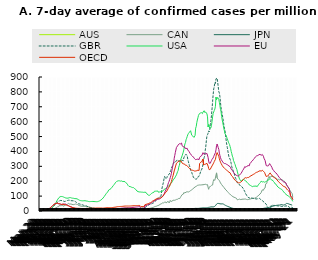
| Category | AUS | CAN | JPN | GBR | USA | EU | OECD |
|---|---|---|---|---|---|---|---|
| 2020-03-01 | 0.068 | 0.057 | 0.124 | 0.141 | 0.007 | 0.235 | 0.472 |
| 2020-03-02 | 0.084 | 0.065 | 0.134 | 0.222 | 0.017 | 0.289 | 0.587 |
| 2020-03-03 | 0.135 | 0.072 | 0.141 | 0.331 | 0.025 | 0.357 | 0.759 |
| 2020-03-04 | 0.208 | 0.084 | 0.16 | 0.445 | 0.04 | 0.464 | 1.047 |
| 2020-03-05 | 0.225 | 0.091 | 0.166 | 0.534 | 0.073 | 0.626 | 1.278 |
| 2020-03-06 | 0.253 | 0.133 | 0.208 | 0.678 | 0.096 | 0.911 | 1.622 |
| 2020-03-07 | 0.214 | 0.129 | 0.25 | 0.784 | 0.165 | 1.123 | 1.865 |
| 2020-03-08 | 0.276 | 0.152 | 0.272 | 0.829 | 0.212 | 1.43 | 2.075 |
| 2020-03-09 | 0.344 | 0.19 | 0.282 | 1.058 | 0.235 | 1.828 | 2.399 |
| 2020-03-10 | 0.383 | 0.186 | 0.325 | 1.492 | 0.308 | 2.412 | 3.005 |
| 2020-03-11 | 0.428 | 0.285 | 0.347 | 2.251 | 0.453 | 3.286 | 3.784 |
| 2020-03-12 | 0.411 | 0.304 | 0.374 | 3.191 | 0.61 | 3.887 | 4.347 |
| 2020-03-13 | 0.789 | 0.547 | 0.354 | 4.046 | 0.863 | 5.992 | 6.385 |
| 2020-03-14 | 1.053 | 0.547 | 0.372 | 4.707 | 1.121 | 7.369 | 7.589 |
| 2020-03-15 | 1.245 | 0.714 | 0.37 | 5.536 | 1.172 | 8.62 | 9.053 |
| 2020-03-16 | 1.611 | 1.285 | 0.358 | 6.53 | 1.778 | 10.068 | 10.18 |
| 2020-03-17 | 1.943 | 1.516 | 0.348 | 7.62 | 2.494 | 11.885 | 11.917 |
| 2020-03-18 | 2.478 | 2.086 | 0.326 | 8.877 | 3.491 | 13.621 | 13.341 |
| 2020-03-19 | 3.115 | 2.596 | 0.308 | 10.087 | 5.256 | 17.135 | 17.04 |
| 2020-03-20 | 3.329 | 2.85 | 0.327 | 11.743 | 7.752 | 19.271 | 19.502 |
| 2020-03-21 | 4.624 | 4.101 | 0.299 | 13.524 | 10.031 | 22.844 | 23.218 |
| 2020-03-22 | 7.052 | 4.625 | 0.315 | 15.52 | 13.79 | 25.918 | 26.673 |
| 2020-03-23 | 7.35 | 6.358 | 0.341 | 19.203 | 18.043 | 28.918 | 29.801 |
| 2020-03-24 | 8.966 | 8.787 | 0.367 | 22.629 | 21.867 | 32.645 | 33.239 |
| 2020-03-25 | 10.115 | 9.858 | 0.437 | 26.25 | 25.969 | 37.127 | 38.121 |
| 2020-03-26 | 11.991 | 12.321 | 0.507 | 30.587 | 31.784 | 40.58 | 40.997 |
| 2020-03-27 | 13.247 | 14.21 | 0.575 | 34.749 | 37.148 | 43.583 | 43.781 |
| 2020-03-28 | 14.469 | 16.338 | 0.757 | 38.222 | 43.082 | 47.144 | 46.858 |
| 2020-03-29 | 13.714 | 18.284 | 0.909 | 41.388 | 47.445 | 49.13 | 48.115 |
| 2020-03-30 | 15.089 | 20.181 | 0.97 | 45.53 | 52.162 | 50.011 | 49.692 |
| 2020-03-31 | 14.165 | 21.803 | 1.174 | 50.113 | 58.993 | 51.635 | 51.206 |
| 2020-04-01 | 14.069 | 23.977 | 1.381 | 54.861 | 67.774 | 51.609 | 51.549 |
| 2020-04-02 | 12.988 | 27.523 | 1.586 | 58.667 | 74.031 | 51.797 | 52.627 |
| 2020-04-03 | 12.318 | 29.473 | 1.837 | 62.331 | 79.952 | 52.132 | 52.475 |
| 2020-04-04 | 10.758 | 28.131 | 2.033 | 64.892 | 85.506 | 48.723 | 49.985 |
| 2020-04-05 | 9.592 | 36.013 | 2.228 | 66.467 | 90.283 | 47.717 | 49.783 |
| 2020-04-06 | 8.088 | 34.831 | 2.386 | 68.609 | 94.339 | 46.899 | 49.268 |
| 2020-04-07 | 7.525 | 35.515 | 2.523 | 70.607 | 96.278 | 45.086 | 47.739 |
| 2020-04-08 | 6.466 | 36.412 | 2.812 | 71.067 | 95.823 | 44.296 | 46.322 |
| 2020-04-09 | 5.587 | 35.61 | 3.163 | 71.039 | 97.435 | 42.886 | 44.248 |
| 2020-04-10 | 4.985 | 36.568 | 3.503 | 69.757 | 98.358 | 43.254 | 44.14 |
| 2020-04-11 | 4.241 | 39.289 | 3.876 | 68.81 | 96.927 | 43.743 | 43.848 |
| 2020-04-12 | 3.537 | 32.467 | 4.07 | 68.598 | 95.786 | 47.378 | 45.256 |
| 2020-04-13 | 3.12 | 34.649 | 4.144 | 66.264 | 93.848 | 46.891 | 43.903 |
| 2020-04-14 | 2.929 | 34.824 | 4.29 | 63.859 | 93.002 | 46.352 | 43.012 |
| 2020-04-15 | 2.422 | 34.463 | 4.316 | 63.723 | 90.474 | 46.486 | 42.495 |
| 2020-04-16 | 1.994 | 38.594 | 4.281 | 64.676 | 87.897 | 47.204 | 42.665 |
| 2020-04-17 | 1.729 | 40.874 | 4.195 | 66.065 | 87.295 | 44.422 | 40.514 |
| 2020-04-18 | 1.493 | 41.957 | 4.07 | 68.5 | 86.785 | 43.809 | 39.975 |
| 2020-04-19 | 1.662 | 43.075 | 3.893 | 69.263 | 86.28 | 39.183 | 36.728 |
| 2020-04-20 | 1.532 | 45.522 | 3.943 | 70.706 | 87.537 | 38.368 | 36.205 |
| 2020-04-21 | 1.295 | 47.001 | 3.806 | 71.635 | 86.271 | 37.557 | 35.531 |
| 2020-04-22 | 1.194 | 51.132 | 3.623 | 72.544 | 87.774 | 35.731 | 34.318 |
| 2020-04-23 | 1.126 | 47.468 | 3.475 | 72.213 | 89.322 | 33.13 | 32.204 |
| 2020-04-24 | 0.873 | 46.005 | 3.277 | 72.23 | 89.016 | 30.718 | 30.213 |
| 2020-04-25 | 0.71 | 45.663 | 2.985 | 70.161 | 90.088 | 29.158 | 29.01 |
| 2020-04-26 | 0.586 | 47.126 | 2.818 | 69.34 | 90.264 | 27.809 | 27.759 |
| 2020-04-27 | 0.552 | 45.446 | 2.623 | 69.006 | 87.598 | 26.951 | 26.761 |
| 2020-04-28 | 0.558 | 44.648 | 2.511 | 68.923 | 87.015 | 25.065 | 24.814 |
| 2020-04-29 | 0.563 | 42.573 | 2.307 | 68.805 | 85.962 | 23.361 | 23.43 |
| 2020-04-30 | 0.586 | 42.406 | 2.054 | 68.406 | 84.068 | 21.673 | 22.266 |
| 2020-05-01 | 0.569 | 43.417 | 1.928 | 67.88 | 85.2 | 21.153 | 22.01 |
| 2020-05-02 | 0.591 | 43.915 | 1.895 | 66.753 | 83.874 | 19.45 | 20.943 |
| 2020-05-03 | 0.608 | 47.396 | 1.874 | 65.698 | 82.915 | 17.978 | 20.126 |
| 2020-05-04 | 0.71 | 46.902 | 1.87 | 62.868 | 83.081 | 17.034 | 19.48 |
| 2020-05-05 | 0.738 | 45.853 | 1.69 | 60.651 | 83.061 | 16.378 | 18.978 |
| 2020-05-06 | 0.8 | 44.956 | 1.56 | 57.222 | 82.244 | 16.094 | 18.676 |
| 2020-05-07 | 0.828 | 44.633 | 1.436 | 54.681 | 81.456 | 15.713 | 18.33 |
| 2020-05-08 | 0.789 | 43.063 | 1.224 | 51.094 | 77.937 | 15.616 | 18.047 |
| 2020-05-09 | 0.789 | 41.775 | 1.011 | 48.805 | 76.973 | 15.656 | 18.065 |
| 2020-05-10 | 0.71 | 36.435 | 0.863 | 47.409 | 74.61 | 15.509 | 17.801 |
| 2020-05-11 | 0.693 | 35.371 | 0.715 | 47.847 | 72.515 | 15.3 | 17.612 |
| 2020-05-12 | 0.591 | 34.98 | 0.672 | 47.217 | 71.826 | 14.938 | 17.426 |
| 2020-05-13 | 0.535 | 33.725 | 0.614 | 46.078 | 70.019 | 13.928 | 16.989 |
| 2020-05-14 | 0.597 | 32.608 | 0.614 | 43.602 | 69.76 | 13.507 | 16.838 |
| 2020-05-15 | 0.659 | 31.487 | 0.575 | 42.465 | 68.85 | 12.867 | 16.569 |
| 2020-05-16 | 0.591 | 31.498 | 0.506 | 42.284 | 68.425 | 12.38 | 16.683 |
| 2020-05-17 | 0.597 | 31.32 | 0.455 | 41.226 | 68.205 | 11.869 | 16.461 |
| 2020-05-18 | 0.552 | 30.962 | 0.45 | 39.069 | 69.563 | 11.452 | 16.407 |
| 2020-05-19 | 0.518 | 30.685 | 0.384 | 38.325 | 68.718 | 11.164 | 16.532 |
| 2020-05-20 | 0.518 | 30.43 | 0.365 | 37.06 | 69.714 | 11.09 | 16.74 |
| 2020-05-21 | 0.428 | 30.256 | 0.301 | 36.916 | 69.256 | 10.449 | 16.549 |
| 2020-05-22 | 0.36 | 30.358 | 0.268 | 35.875 | 68.782 | 10.262 | 16.741 |
| 2020-05-23 | 0.394 | 30.195 | 0.235 | 34.683 | 67.456 | 10.162 | 17.548 |
| 2020-05-24 | 0.338 | 29.545 | 0.255 | 33.661 | 68.197 | 9.856 | 17.631 |
| 2020-05-25 | 0.327 | 29.294 | 0.241 | 31.594 | 66.579 | 9.569 | 17.874 |
| 2020-05-26 | 0.377 | 28.872 | 0.243 | 28.621 | 65.989 | 9.344 | 17.783 |
| 2020-05-27 | 0.389 | 28.177 | 0.234 | 26.689 | 64.184 | 9.083 | 17.642 |
| 2020-05-28 | 0.394 | 27.493 | 0.267 | 24.961 | 62.685 | 9.477 | 18.023 |
| 2020-05-29 | 0.479 | 26.459 | 0.326 | 23.837 | 63.04 | 9.344 | 17.877 |
| 2020-05-30 | 0.439 | 24.817 | 0.346 | 22.965 | 64.137 | 9.145 | 18.429 |
| 2020-05-31 | 0.496 | 24.22 | 0.339 | 22.369 | 63.667 | 9.159 | 18.685 |
| 2020-06-01 | 0.535 | 23.445 | 0.356 | 21.999 | 63.129 | 9.177 | 18.839 |
| 2020-06-02 | 0.507 | 22.309 | 0.379 | 21.608 | 63.935 | 8.923 | 18.615 |
| 2020-06-03 | 0.507 | 21.48 | 0.384 | 20.625 | 64.503 | 8.651 | 18.583 |
| 2020-06-04 | 0.462 | 20.116 | 0.354 | 19.556 | 64.206 | 8.503 | 18.501 |
| 2020-06-05 | 0.383 | 19.147 | 0.322 | 18.703 | 64.61 | 8.709 | 18.725 |
| 2020-06-06 | 0.377 | 18.219 | 0.321 | 18.045 | 63.533 | 9.01 | 18.979 |
| 2020-06-07 | 0.355 | 17.858 | 0.326 | 17.292 | 63.067 | 9.192 | 19.419 |
| 2020-06-08 | 0.259 | 17.068 | 0.309 | 16.548 | 63.155 | 9.324 | 19.347 |
| 2020-06-09 | 0.253 | 16.27 | 0.31 | 15.877 | 61.798 | 9.748 | 19.638 |
| 2020-06-10 | 0.253 | 15.502 | 0.316 | 15.535 | 62.344 | 10.305 | 20.182 |
| 2020-06-11 | 0.237 | 14.784 | 0.312 | 15.037 | 62.994 | 10.154 | 20.24 |
| 2020-06-12 | 0.237 | 13.864 | 0.33 | 14.926 | 62.762 | 10.154 | 20.752 |
| 2020-06-13 | 0.344 | 13.56 | 0.332 | 15.131 | 64.523 | 10.108 | 19.68 |
| 2020-06-14 | 0.394 | 12.26 | 0.373 | 15.324 | 64.973 | 9.992 | 19.798 |
| 2020-06-15 | 0.451 | 11.341 | 0.429 | 15.195 | 65.922 | 9.946 | 19.984 |
| 2020-06-16 | 0.541 | 10.816 | 0.422 | 15.033 | 68.223 | 10.029 | 20.408 |
| 2020-06-17 | 0.597 | 10.531 | 0.434 | 14.637 | 70.814 | 10.166 | 19.849 |
| 2020-06-18 | 0.676 | 10.33 | 0.454 | 14.678 | 73.161 | 10.497 | 20.079 |
| 2020-06-19 | 0.659 | 10.333 | 0.462 | 14.522 | 76.076 | 10.461 | 20.211 |
| 2020-06-20 | 0.794 | 10.333 | 0.489 | 14.05 | 79.149 | 10.235 | 19.584 |
| 2020-06-21 | 0.783 | 10.162 | 0.465 | 13.654 | 81.847 | 10.126 | 19.383 |
| 2020-06-22 | 0.817 | 10.09 | 0.431 | 13.368 | 87.215 | 10.209 | 19.528 |
| 2020-06-23 | 0.85 | 10.185 | 0.447 | 12.951 | 93.049 | 10.507 | 19.765 |
| 2020-06-24 | 0.941 | 9.866 | 0.49 | 12.474 | 96.884 | 10.656 | 20.521 |
| 2020-06-25 | 1.048 | 9.828 | 0.528 | 11.784 | 102.016 | 10.441 | 20.624 |
| 2020-06-26 | 1.07 | 8.798 | 0.57 | 11.053 | 108.297 | 10.776 | 20.713 |
| 2020-06-27 | 1.267 | 8.042 | 0.599 | 10.982 | 112.247 | 11.337 | 21.242 |
| 2020-06-28 | 1.633 | 8.038 | 0.663 | 10.497 | 119.029 | 11.757 | 21.493 |
| 2020-06-29 | 1.926 | 9.167 | 0.742 | 9.882 | 123.003 | 12.017 | 21.868 |
| 2020-06-30 | 2.247 | 8.855 | 0.833 | 8.858 | 127.074 | 11.886 | 21.92 |
| 2020-07-01 | 2.495 | 8.365 | 0.99 | 7.332 | 134.013 | 11.749 | 22.032 |
| 2020-07-02 | 2.653 | 8.285 | 1.131 | 5.85 | 141.113 | 11.905 | 22.257 |
| 2020-07-03 | 3.712 | 8.867 | 1.157 | 5.56 | 143.448 | 11.868 | 22.327 |
| 2020-07-04 | 4.264 | 8.768 | 1.366 | 5.54 | 145.335 | 11.547 | 22.231 |
| 2020-07-05 | 4.613 | 8.365 | 1.473 | 5.799 | 149.704 | 11.672 | 22.542 |
| 2020-07-06 | 5.187 | 7.544 | 1.552 | 5.26 | 150.488 | 11.567 | 22.448 |
| 2020-07-07 | 5.441 | 7.32 | 1.629 | 5.641 | 156.679 | 11.501 | 22.741 |
| 2020-07-08 | 5.942 | 7.776 | 1.61 | 6.859 | 160.291 | 11.679 | 22.965 |
| 2020-07-09 | 7.367 | 7.65 | 1.767 | 8.223 | 162.844 | 11.99 | 23.52 |
| 2020-07-10 | 7.282 | 7.685 | 2.103 | 8.244 | 170.11 | 12.139 | 24.063 |
| 2020-07-11 | 7.626 | 7.468 | 2.228 | 8.663 | 176.356 | 12.665 | 24.514 |
| 2020-07-12 | 7.868 | 7.426 | 2.459 | 8.95 | 179.695 | 12.933 | 24.883 |
| 2020-07-13 | 8.426 | 8.243 | 2.576 | 9.33 | 186.576 | 13.178 | 25.444 |
| 2020-07-14 | 9.017 | 8.844 | 2.695 | 10.739 | 189.789 | 13.714 | 25.992 |
| 2020-07-15 | 9.879 | 8.965 | 3.294 | 10.542 | 193.271 | 13.846 | 26.422 |
| 2020-07-16 | 10.47 | 9.456 | 3.273 | 10.54 | 199.07 | 14.901 | 27.544 |
| 2020-07-17 | 10.634 | 9.786 | 3.462 | 10.914 | 200.9 | 15.791 | 28.341 |
| 2020-07-18 | 11.293 | 10.356 | 3.978 | 10.929 | 201.989 | 15.795 | 28.779 |
| 2020-07-19 | 11.766 | 10.717 | 4.079 | 11.091 | 202.876 | 16.169 | 28.897 |
| 2020-07-20 | 12.261 | 11.227 | 4.052 | 11.198 | 204.266 | 16.898 | 29.556 |
| 2020-07-21 | 13.557 | 11.869 | 4.555 | 9.499 | 202.736 | 17.254 | 29.875 |
| 2020-07-22 | 14.035 | 11.77 | 4.485 | 9.546 | 203.8 | 18.384 | 30.754 |
| 2020-07-23 | 13.303 | 12.367 | 5.209 | 9.82 | 200.588 | 18.115 | 30.499 |
| 2020-07-24 | 14.131 | 13.514 | 5.407 | 9.993 | 201.05 | 18.276 | 30.614 |
| 2020-07-25 | 14.649 | 13.663 | 5.361 | 9.864 | 202.086 | 19.139 | 30.853 |
| 2020-07-26 | 16.142 | 13.762 | 5.772 | 9.905 | 199.605 | 19.164 | 30.979 |
| 2020-07-27 | 16.193 | 13.427 | 6.15 | 10.13 | 197.325 | 19.716 | 31.467 |
| 2020-07-28 | 15.139 | 12.914 | 6.396 | 10.348 | 198.168 | 19.604 | 31.797 |
| 2020-07-29 | 16.874 | 13.556 | 7.067 | 10.854 | 198.729 | 20.298 | 32.484 |
| 2020-07-30 | 18.631 | 12.462 | 7.954 | 11.019 | 198.301 | 20.865 | 32.968 |
| 2020-07-31 | 18.755 | 12.032 | 8.317 | 11.258 | 196.297 | 21.142 | 33.146 |
| 2020-08-01 | 19.668 | 11.603 | 9.187 | 11.245 | 192.497 | 21.111 | 33.273 |
| 2020-08-02 | 19.054 | 11.322 | 9.694 | 11.241 | 188.48 | 20.991 | 33.278 |
| 2020-08-03 | 19.302 | 9.509 | 10.134 | 11.782 | 183.552 | 21.29 | 33.396 |
| 2020-08-04 | 21.757 | 10.596 | 10.444 | 12.045 | 180.22 | 22.169 | 33.454 |
| 2020-08-05 | 20.231 | 10.17 | 10.527 | 12.246 | 172.649 | 21.975 | 33.164 |
| 2020-08-06 | 18.975 | 10.299 | 10.209 | 12.468 | 169.124 | 22.382 | 33.309 |
| 2020-08-07 | 19.251 | 9.965 | 10.782 | 12.449 | 165.023 | 22.754 | 33.7 |
| 2020-08-08 | 17.961 | 9.976 | 10.791 | 12.442 | 164.124 | 22.644 | 33.458 |
| 2020-08-09 | 17.342 | 9.877 | 10.936 | 13.124 | 164.215 | 22.781 | 33.492 |
| 2020-08-10 | 16.801 | 11.705 | 10.769 | 12.863 | 165.127 | 23.234 | 33.887 |
| 2020-08-11 | 15.106 | 10.375 | 10.132 | 13.885 | 160.427 | 22.876 | 34.09 |
| 2020-08-12 | 13.9 | 10.147 | 9.732 | 14.137 | 161.12 | 23.203 | 34.357 |
| 2020-08-13 | 13.912 | 10.615 | 9.395 | 14.52 | 157.619 | 23.601 | 34.645 |
| 2020-08-14 | 13.162 | 10.269 | 9.112 | 15.736 | 160.249 | 24.159 | 34.817 |
| 2020-08-15 | 12.408 | 10.174 | 8.722 | 16.279 | 157.117 | 24.677 | 35.349 |
| 2020-08-16 | 12.171 | 10.022 | 8.25 | 16.371 | 154.261 | 24.839 | 35.663 |
| 2020-08-17 | 11.602 | 8.228 | 8.033 | 16.151 | 149.496 | 25.135 | 35.371 |
| 2020-08-18 | 10.487 | 10.242 | 8.298 | 16.025 | 148.204 | 25.781 | 35.757 |
| 2020-08-19 | 10.577 | 10.28 | 8.418 | 15.604 | 144.422 | 26.181 | 36.012 |
| 2020-08-20 | 9.378 | 9.292 | 8.405 | 15.717 | 141.257 | 26.784 | 36.152 |
| 2020-08-21 | 8.826 | 10.314 | 8.068 | 14.847 | 134.071 | 27.531 | 36.403 |
| 2020-08-22 | 8.583 | 10.394 | 7.767 | 15.437 | 132.384 | 27.708 | 36.434 |
| 2020-08-23 | 7.643 | 10.691 | 7.449 | 15.3 | 130.225 | 27.967 | 36.082 |
| 2020-08-24 | 7.209 | 12.83 | 7.287 | 15.854 | 130.158 | 28.885 | 37.178 |
| 2020-08-25 | 6.843 | 10.714 | 7.074 | 16.057 | 128.124 | 29.239 | 37.151 |
| 2020-08-26 | 6.117 | 11.295 | 6.846 | 16.561 | 127.169 | 29.599 | 37.334 |
| 2020-08-27 | 5.863 | 12.203 | 6.509 | 17.288 | 127.753 | 29.657 | 37.502 |
| 2020-08-28 | 5.322 | 11.489 | 6.279 | 17.807 | 126.89 | 16.451 | 28.999 |
| 2020-08-29 | 4.838 | 11.702 | 6.151 | 17.423 | 126.754 | 16.74 | 29.084 |
| 2020-08-30 | 4.68 | 11.671 | 5.996 | 18.863 | 126.819 | 16.861 | 29.344 |
| 2020-08-31 | 4.314 | 12.633 | 5.926 | 19.791 | 126.325 | 17.431 | 29.587 |
| 2020-09-01 | 4.05 | 13.374 | 5.81 | 20.028 | 126.98 | 17.623 | 29.896 |
| 2020-09-02 | 4.095 | 13.534 | 5.476 | 21.011 | 125.173 | 18.746 | 31.154 |
| 2020-09-03 | 3.875 | 14.028 | 5.233 | 21.467 | 124.663 | 19.641 | 31.945 |
| 2020-09-04 | 3.717 | 14.438 | 4.941 | 22.886 | 126.206 | 33.97 | 41.758 |
| 2020-09-05 | 3.424 | 14.715 | 4.655 | 24.393 | 126.362 | 35.084 | 42.682 |
| 2020-09-06 | 3.239 | 15.21 | 4.48 | 27.114 | 124.964 | 36.481 | 44.183 |
| 2020-09-07 | 3.12 | 12.834 | 4.319 | 30.41 | 119.819 | 38.053 | 45.435 |
| 2020-09-08 | 3.053 | 16.475 | 4.187 | 32.9 | 113.521 | 39.78 | 46.908 |
| 2020-09-09 | 2.675 | 15.939 | 4.124 | 35.36 | 110.493 | 40.473 | 47.497 |
| 2020-09-10 | 2.411 | 16.832 | 4.116 | 37.891 | 106.952 | 42.457 | 49.323 |
| 2020-09-11 | 2.253 | 17.235 | 4.177 | 41.309 | 105.813 | 44.236 | 51.031 |
| 2020-09-12 | 2.101 | 17.684 | 4.23 | 44.908 | 104.932 | 46.497 | 53.003 |
| 2020-09-13 | 2.09 | 18.052 | 4.218 | 45.639 | 106.317 | 47.33 | 53.966 |
| 2020-09-14 | 2.061 | 22.054 | 4.187 | 44.94 | 111.043 | 49.568 | 56.254 |
| 2020-09-15 | 1.763 | 19.546 | 4.211 | 46.315 | 116.316 | 51.793 | 58.677 |
| 2020-09-16 | 1.628 | 21.727 | 4.224 | 49.162 | 118.475 | 54.407 | 60.832 |
| 2020-09-17 | 1.673 | 22.51 | 4.041 | 50.179 | 122.42 | 58.387 | 64.218 |
| 2020-09-18 | 1.566 | 24.236 | 3.963 | 51.853 | 123.075 | 62.603 | 67.669 |
| 2020-09-19 | 1.391 | 24.486 | 3.91 | 53.83 | 123.553 | 63.789 | 69.588 |
| 2020-09-20 | 1.239 | 27.021 | 3.955 | 55.046 | 125.321 | 65.991 | 70.423 |
| 2020-09-21 | 1.143 | 28.447 | 4.014 | 58.781 | 132.957 | 68.769 | 73.091 |
| 2020-09-22 | 1.093 | 30.233 | 3.764 | 62.677 | 133.111 | 71.569 | 76.05 |
| 2020-09-23 | 0.941 | 30.734 | 3.408 | 67.352 | 133.131 | 73.613 | 78.954 |
| 2020-09-24 | 0.783 | 31.194 | 3.396 | 74.275 | 133.99 | 74.144 | 80.76 |
| 2020-09-25 | 0.738 | 32.927 | 3.386 | 79.728 | 133.554 | 75.442 | 83.448 |
| 2020-09-26 | 0.8 | 34.824 | 3.441 | 83.189 | 134.639 | 76.966 | 85.056 |
| 2020-09-27 | 0.743 | 36.781 | 3.444 | 87.021 | 134.244 | 78.241 | 86.691 |
| 2020-09-28 | 0.636 | 36.621 | 3.419 | 86.329 | 126.089 | 78.622 | 85.034 |
| 2020-09-29 | 0.597 | 38.522 | 3.676 | 91.067 | 127.65 | 77.708 | 83.473 |
| 2020-09-30 | 0.653 | 42.444 | 4.053 | 93.055 | 127.812 | 80.981 | 86.154 |
| 2020-10-01 | 0.614 | 45.009 | 4.247 | 93.654 | 127.177 | 82.921 | 87.37 |
| 2020-10-02 | 0.591 | 46.886 | 4.202 | 93.857 | 130.084 | 85.994 | 88.421 |
| 2020-10-03 | 0.535 | 47.848 | 4.121 | 108.456 | 131.774 | 89.297 | 89.604 |
| 2020-10-04 | 0.586 | 49.684 | 4.028 | 145.368 | 130.994 | 91.667 | 92.126 |
| 2020-10-05 | 0.665 | 53.834 | 4.009 | 163.641 | 133.699 | 94.754 | 98.113 |
| 2020-10-06 | 0.58 | 56.114 | 3.98 | 179.456 | 134.485 | 99.622 | 102.577 |
| 2020-10-07 | 0.62 | 54.244 | 3.901 | 194.534 | 139.546 | 104.472 | 104.926 |
| 2020-10-08 | 0.659 | 56.247 | 3.886 | 217.247 | 145.178 | 112.34 | 109.777 |
| 2020-10-09 | 0.693 | 59.177 | 3.959 | 231.987 | 145.796 | 121.043 | 115.258 |
| 2020-10-10 | 0.721 | 62.354 | 4.092 | 236.89 | 148.574 | 132.54 | 122.233 |
| 2020-10-11 | 0.772 | 60.435 | 4.134 | 215.325 | 153.024 | 140.763 | 126.572 |
| 2020-10-12 | 0.772 | 53.184 | 4.101 | 218.273 | 154.066 | 144.651 | 128.019 |
| 2020-10-13 | 0.879 | 59.793 | 4.088 | 224.023 | 157.109 | 154.651 | 133.434 |
| 2020-10-14 | 0.85 | 63.407 | 4.135 | 235.911 | 160.896 | 166.535 | 140.926 |
| 2020-10-15 | 0.817 | 63.21 | 4.212 | 238.985 | 163.636 | 180.02 | 148.777 |
| 2020-10-16 | 0.755 | 61.959 | 4.273 | 242.771 | 169.192 | 191.61 | 156.116 |
| 2020-10-17 | 0.715 | 54.347 | 4.195 | 244.921 | 169.983 | 199.737 | 160.621 |
| 2020-10-18 | 0.642 | 62.332 | 4.184 | 253.704 | 171.462 | 212.231 | 168.385 |
| 2020-10-19 | 0.535 | 71.194 | 4.25 | 264.03 | 182.739 | 223.855 | 177.666 |
| 2020-10-20 | 0.597 | 64.076 | 4.234 | 272.789 | 186.971 | 235.958 | 185.873 |
| 2020-10-21 | 0.569 | 64.502 | 4.323 | 287.673 | 188.502 | 253.333 | 197.616 |
| 2020-10-22 | 0.591 | 65.577 | 4.222 | 292.503 | 193.468 | 273.613 | 211.346 |
| 2020-10-23 | 0.659 | 66.854 | 4.327 | 302.968 | 199.041 | 294.519 | 225.776 |
| 2020-10-24 | 0.693 | 72.148 | 4.445 | 317.591 | 210.353 | 311.086 | 237.292 |
| 2020-10-25 | 0.71 | 68.675 | 4.522 | 323.595 | 215.924 | 320.428 | 243.56 |
| 2020-10-26 | 0.755 | 71.685 | 4.633 | 328.056 | 215.772 | 354.012 | 269 |
| 2020-10-27 | 0.62 | 73.554 | 4.81 | 331.38 | 222.245 | 373.064 | 281.744 |
| 2020-10-28 | 0.603 | 73.463 | 4.935 | 327.133 | 229.261 | 392.775 | 295.791 |
| 2020-10-29 | 0.58 | 75.12 | 5.137 | 331.038 | 235.682 | 409.999 | 308.514 |
| 2020-10-30 | 0.507 | 77.606 | 5.184 | 339.318 | 243.207 | 426.838 | 320.593 |
| 2020-10-31 | 0.462 | 80.806 | 5.349 | 336.974 | 246.239 | 432.657 | 323.894 |
| 2020-11-01 | 0.428 | 78.955 | 5.485 | 344.378 | 264.826 | 437.459 | 326.785 |
| 2020-11-02 | 0.4 | 76.789 | 5.576 | 340.231 | 272.619 | 444.24 | 332.9 |
| 2020-11-03 | 0.389 | 84.42 | 5.841 | 334.103 | 294.499 | 450.287 | 335.709 |
| 2020-11-04 | 0.366 | 84.872 | 5.715 | 335.123 | 305.468 | 451.7 | 335.675 |
| 2020-11-05 | 0.366 | 83.987 | 5.985 | 337.416 | 322.138 | 451.87 | 335.143 |
| 2020-11-06 | 0.377 | 90.968 | 6.433 | 335.026 | 334.657 | 450.834 | 333.29 |
| 2020-11-07 | 0.355 | 98.463 | 6.915 | 341.529 | 351.089 | 456.808 | 336.352 |
| 2020-11-08 | 0.36 | 104.574 | 7.299 | 335.796 | 355.539 | 456.342 | 336.113 |
| 2020-11-09 | 0.332 | 109.674 | 7.648 | 340.926 | 370.887 | 438.203 | 321.75 |
| 2020-11-10 | 0.276 | 108.561 | 8.121 | 341.768 | 376.71 | 437.747 | 321.22 |
| 2020-11-11 | 0.253 | 113.129 | 9.145 | 337.008 | 394.997 | 431.624 | 316.938 |
| 2020-11-12 | 0.18 | 123.352 | 9.833 | 356.955 | 410.441 | 435.301 | 319.247 |
| 2020-11-13 | 0.169 | 120.984 | 10.436 | 365.535 | 433.24 | 431.889 | 316.44 |
| 2020-11-14 | 0.299 | 121.304 | 10.945 | 369.602 | 450.784 | 422.525 | 311.022 |
| 2020-11-15 | 0.473 | 122.66 | 11.56 | 378.986 | 459.99 | 416.479 | 307.008 |
| 2020-11-16 | 0.501 | 127.077 | 11.728 | 379.014 | 478.431 | 419.611 | 307.125 |
| 2020-11-17 | 0.597 | 127.141 | 12.174 | 378.242 | 488.627 | 418.705 | 306.495 |
| 2020-11-18 | 0.62 | 129.171 | 12.973 | 371.101 | 500.182 | 420.972 | 306.701 |
| 2020-11-19 | 0.653 | 126.586 | 13.808 | 348.539 | 511.807 | 410 | 297.843 |
| 2020-11-20 | 0.698 | 127.411 | 14.623 | 333.472 | 519.6 | 403.611 | 293.018 |
| 2020-11-21 | 0.62 | 129.414 | 15.566 | 318.542 | 524.611 | 400.921 | 291.095 |
| 2020-11-22 | 0.479 | 131.101 | 16.318 | 305.076 | 529.207 | 398.448 | 290.161 |
| 2020-11-23 | 0.479 | 133.997 | 16.968 | 292.437 | 534.214 | 387.816 | 282.742 |
| 2020-11-24 | 0.428 | 137.114 | 16.45 | 273.73 | 539.259 | 383.905 | 279.854 |
| 2020-11-25 | 0.451 | 138.786 | 16.132 | 270.746 | 543.659 | 376.856 | 275.576 |
| 2020-11-26 | 0.456 | 142.149 | 16.254 | 259.289 | 509.178 | 374.346 | 274.803 |
| 2020-11-27 | 0.451 | 145.824 | 16.397 | 247.505 | 513.483 | 369.64 | 274.093 |
| 2020-11-28 | 0.4 | 148.553 | 16.503 | 238.947 | 503.15 | 364.614 | 272.575 |
| 2020-11-29 | 0.383 | 150.978 | 16.384 | 225.038 | 500.3 | 362.021 | 271.853 |
| 2020-11-30 | 0.389 | 155.158 | 16.301 | 218.369 | 494.259 | 357.366 | 269.702 |
| 2020-12-01 | 0.394 | 155.968 | 17.186 | 222.922 | 499.789 | 351.454 | 268.446 |
| 2020-12-02 | 0.417 | 161.653 | 17.76 | 218.555 | 508.175 | 349.346 | 269.796 |
| 2020-12-03 | 0.428 | 163.877 | 17.778 | 212.833 | 556.612 | 345.029 | 268.851 |
| 2020-12-04 | 0.394 | 165.644 | 17.66 | 216.165 | 567.317 | 343.996 | 267.755 |
| 2020-12-05 | 0.411 | 168.224 | 17.438 | 215.456 | 593.434 | 346.967 | 270.754 |
| 2020-12-06 | 0.394 | 171.728 | 17.426 | 226.391 | 611.182 | 348.927 | 273.179 |
| 2020-12-07 | 0.422 | 171.078 | 17.505 | 231.495 | 626.105 | 348.679 | 274.37 |
| 2020-12-08 | 0.394 | 173.648 | 17.668 | 229.042 | 641.891 | 347.112 | 273.344 |
| 2020-12-09 | 0.344 | 173.439 | 18.099 | 229.914 | 650.588 | 344.99 | 271.962 |
| 2020-12-10 | 0.349 | 175.042 | 18.632 | 242.922 | 654.027 | 359.741 | 319.156 |
| 2020-12-11 | 0.389 | 176.167 | 19.147 | 254.409 | 657.157 | 363.523 | 323.004 |
| 2020-12-12 | 0.366 | 174.761 | 19.689 | 267.153 | 658.046 | 368.559 | 327.631 |
| 2020-12-13 | 0.366 | 173.283 | 20.051 | 269.666 | 660.959 | 372.604 | 330.615 |
| 2020-12-14 | 0.344 | 175.764 | 20.226 | 281.519 | 660.942 | 373.147 | 332.427 |
| 2020-12-15 | 0.377 | 176.042 | 20.546 | 294.705 | 654.203 | 379.109 | 337.492 |
| 2020-12-16 | 0.406 | 176.471 | 20.73 | 313.051 | 664.718 | 391.954 | 349.223 |
| 2020-12-17 | 0.462 | 177.688 | 20.981 | 343.871 | 668.291 | 383.482 | 309.505 |
| 2020-12-18 | 0.569 | 177.631 | 20.867 | 358.481 | 673.51 | 387.041 | 313.854 |
| 2020-12-19 | 0.777 | 179.436 | 20.98 | 370.346 | 662.334 | 385.386 | 313.611 |
| 2020-12-20 | 0.907 | 179.782 | 21.079 | 407.711 | 662.385 | 384.434 | 314.746 |
| 2020-12-21 | 0.963 | 176.741 | 21.229 | 435.714 | 664.225 | 383.692 | 315.686 |
| 2020-12-22 | 0.997 | 176.802 | 21.474 | 474.944 | 659.44 | 388.149 | 321.265 |
| 2020-12-23 | 1.07 | 178.356 | 21.786 | 505.031 | 652.005 | 386.673 | 320.157 |
| 2020-12-24 | 1.019 | 177.133 | 22.423 | 512.839 | 632.193 | 381.327 | 317.945 |
| 2020-12-25 | 0.963 | 158.316 | 23.558 | 521.855 | 565.029 | 360.179 | 301.611 |
| 2020-12-26 | 0.789 | 145.604 | 24.497 | 538.187 | 579.992 | 335.587 | 286.978 |
| 2020-12-27 | 0.783 | 161.159 | 25.052 | 530.518 | 565.985 | 321.099 | 277.279 |
| 2020-12-28 | 0.732 | 156.933 | 25.697 | 547.663 | 555.359 | 314.502 | 274.609 |
| 2020-12-29 | 0.811 | 164.264 | 26.795 | 582.572 | 556.335 | 320.883 | 280.481 |
| 2020-12-30 | 0.805 | 170.109 | 27.452 | 605.627 | 558.104 | 331.21 | 289.033 |
| 2020-12-31 | 0.85 | 171.854 | 28.333 | 641.656 | 576.15 | 338.44 | 295.455 |
| 2021-01-01 | 0.918 | 168.973 | 27.712 | 685.603 | 600.514 | 347.005 | 302.844 |
| 2021-01-02 | 0.991 | 174.374 | 26.735 | 734.831 | 632.73 | 349.242 | 307.71 |
| 2021-01-03 | 0.941 | 197.332 | 27.019 | 783.245 | 655.846 | 356.441 | 316.45 |
| 2021-01-04 | 0.946 | 210.987 | 28.103 | 820.435 | 660.045 | 366.406 | 324.187 |
| 2021-01-05 | 0.873 | 207.419 | 29.593 | 837.067 | 675.216 | 375.043 | 332.466 |
| 2021-01-06 | 0.794 | 205.986 | 31.962 | 863.356 | 684.686 | 375.198 | 335.123 |
| 2021-01-07 | 0.822 | 210.106 | 35.383 | 856.358 | 703.237 | 392.042 | 347.433 |
| 2021-01-08 | 0.687 | 241.444 | 40.594 | 887.924 | 764.859 | 410.885 | 365.819 |
| 2021-01-09 | 0.625 | 256.107 | 45.98 | 892.654 | 747.617 | 439.251 | 385.403 |
| 2021-01-10 | 0.62 | 222.442 | 49.245 | 892.547 | 749.577 | 450.079 | 392.424 |
| 2021-01-11 | 0.659 | 215.856 | 51.05 | 865.583 | 762.943 | 444.643 | 388.875 |
| 2021-01-12 | 0.642 | 211.641 | 50.631 | 832.702 | 759.378 | 425.906 | 375.671 |
| 2021-01-13 | 0.642 | 208.057 | 50.482 | 801.074 | 748.462 | 413.572 | 367.191 |
| 2021-01-14 | 0.552 | 205.093 | 49.386 | 792.661 | 729.929 | 388.785 | 350.718 |
| 2021-01-15 | 0.603 | 196.135 | 48.565 | 766.387 | 707.087 | 371.523 | 337.537 |
| 2021-01-16 | 0.636 | 188.405 | 47.751 | 726.64 | 681.402 | 358.888 | 327.937 |
| 2021-01-17 | 0.603 | 184.608 | 47.403 | 691.71 | 665.967 | 347.184 | 319.777 |
| 2021-01-18 | 0.546 | 177.368 | 47.36 | 673.255 | 634.814 | 342.716 | 313.081 |
| 2021-01-19 | 0.507 | 173.138 | 48.275 | 647.224 | 612.96 | 335.241 | 305.992 |
| 2021-01-20 | 0.501 | 167.673 | 47.935 | 628.799 | 592.45 | 329.427 | 301.114 |
| 2021-01-21 | 0.484 | 162.596 | 46.835 | 605.736 | 574.219 | 323.627 | 294.76 |
| 2021-01-22 | 0.4 | 158.594 | 44.468 | 572.605 | 551.597 | 320.387 | 290.694 |
| 2021-01-23 | 0.327 | 153.786 | 41.846 | 555.954 | 538.076 | 318.932 | 286.853 |
| 2021-01-24 | 0.315 | 147.687 | 39.807 | 537.585 | 517.742 | 318.35 | 282.872 |
| 2021-01-25 | 0.276 | 144.635 | 37.426 | 504.796 | 521.465 | 318.037 | 279.892 |
| 2021-01-26 | 0.259 | 140.884 | 35.703 | 476.438 | 508.771 | 314.534 | 276.22 |
| 2021-01-27 | 0.253 | 135.635 | 33.913 | 447.374 | 496.023 | 312.824 | 273.82 |
| 2021-01-28 | 0.248 | 130.676 | 32.262 | 427.684 | 485.052 | 311.647 | 271.464 |
| 2021-01-29 | 0.259 | 126.875 | 30.555 | 403.783 | 474.526 | 308.959 | 267.454 |
| 2021-01-30 | 0.253 | 123.135 | 28.931 | 381.816 | 462.209 | 304.828 | 262.915 |
| 2021-01-31 | 0.231 | 120.3 | 27.456 | 362.758 | 453.911 | 302.154 | 260.29 |
| 2021-02-01 | 0.242 | 116.063 | 26.33 | 355.089 | 446.614 | 300.445 | 260.361 |
| 2021-02-02 | 0.242 | 111.909 | 24.579 | 348.146 | 432.597 | 297.426 | 256.501 |
| 2021-02-03 | 0.248 | 107.907 | 23.101 | 335.095 | 418.537 | 289.944 | 248.642 |
| 2021-02-04 | 0.242 | 104.775 | 21.325 | 317.897 | 399.111 | 280.829 | 240.457 |
| 2021-02-05 | 0.237 | 102.149 | 20.001 | 296.597 | 385.109 | 276.782 | 236.586 |
| 2021-02-06 | 0.225 | 98.934 | 18.814 | 285.881 | 368.43 | 272.015 | 232.422 |
| 2021-02-07 | 0.22 | 96.175 | 17.649 | 274.675 | 358.703 | 267.962 | 229.556 |
| 2021-02-08 | 0.208 | 93.518 | 17.012 | 265.05 | 339.167 | 260.961 | 221.327 |
| 2021-02-09 | 0.237 | 92.511 | 16.158 | 255.482 | 330.593 | 252.498 | 214.578 |
| 2021-02-10 | 0.231 | 92.515 | 15.312 | 242.253 | 319.075 | 247.939 | 208.975 |
| 2021-02-11 | 0.253 | 89.456 | 14.293 | 226.992 | 311.147 | 246.819 | 206.482 |
| 2021-02-12 | 0.248 | 83.918 | 13.105 | 218.506 | 296.019 | 241.088 | 200.794 |
| 2021-02-13 | 0.265 | 85.944 | 12.078 | 207.915 | 288.679 | 239.943 | 198.498 |
| 2021-02-14 | 0.242 | 82.132 | 11.754 | 197.499 | 277.961 | 238.204 | 194.861 |
| 2021-02-15 | 0.253 | 74.379 | 11.467 | 188.224 | 262.237 | 236.156 | 192.914 |
| 2021-02-16 | 0.225 | 80.217 | 11.184 | 184.507 | 247.913 | 237.379 | 191.683 |
| 2021-02-17 | 0.186 | 77.53 | 10.705 | 183.874 | 237.006 | 236.268 | 189.345 |
| 2021-02-18 | 0.175 | 78.51 | 10.518 | 180.803 | 221.41 | 237.012 | 188.334 |
| 2021-02-19 | 0.158 | 80.046 | 10.496 | 174.14 | 212.557 | 242.204 | 189.924 |
| 2021-02-20 | 0.158 | 75.713 | 10.351 | 167.94 | 205.769 | 246.622 | 190.904 |
| 2021-02-21 | 0.169 | 76.485 | 9.995 | 165.507 | 202.313 | 250.961 | 194.671 |
| 2021-02-22 | 0.18 | 82.907 | 9.728 | 167.38 | 203.198 | 254.668 | 196.261 |
| 2021-02-23 | 0.158 | 79.084 | 9.496 | 162.814 | 207.352 | 262.459 | 201.019 |
| 2021-02-24 | 0.197 | 80.544 | 8.866 | 156.874 | 209.36 | 270.885 | 206.102 |
| 2021-02-25 | 0.22 | 79.449 | 8.367 | 152.445 | 212.657 | 276.109 | 209.381 |
| 2021-02-26 | 0.253 | 79.787 | 8.095 | 144.955 | 211.808 | 281.6 | 212.936 |
| 2021-02-27 | 0.248 | 79.875 | 8.079 | 138.603 | 208.784 | 289.796 | 218.727 |
| 2021-02-28 | 0.27 | 79.647 | 8.035 | 130.482 | 206.293 | 298.19 | 222.348 |
| 2021-03-01 | 0.276 | 80.563 | 7.98 | 119.397 | 207.167 | 300.805 | 223.834 |
| 2021-03-02 | 0.321 | 78.472 | 7.775 | 114.913 | 200.55 | 293.621 | 218.973 |
| 2021-03-03 | 0.338 | 77.86 | 8.16 | 107.319 | 197.269 | 297.401 | 221.621 |
| 2021-03-04 | 0.36 | 77.226 | 8.233 | 100.025 | 193.156 | 301.398 | 223.69 |
| 2021-03-05 | 0.36 | 76.447 | 8.315 | 94.517 | 188.415 | 304.892 | 225.236 |
| 2021-03-06 | 0.36 | 76.785 | 7.401 | 91.535 | 185.641 | 305.24 | 225.583 |
| 2021-03-07 | 0.383 | 77.929 | 8.221 | 89.701 | 181.137 | 304.696 | 225.363 |
| 2021-03-08 | 0.422 | 79.274 | 8.145 | 88.113 | 175.395 | 303.757 | 224.186 |
| 2021-03-09 | 0.439 | 80.281 | 8.431 | 86.777 | 175.648 | 317.979 | 232.159 |
| 2021-03-10 | 0.467 | 81.326 | 8.448 | 85.796 | 171.612 | 320.763 | 232.892 |
| 2021-03-11 | 0.456 | 81.801 | 8.622 | 86.181 | 169.185 | 327.451 | 236.688 |
| 2021-03-12 | 0.467 | 83.884 | 8.774 | 87.598 | 167.04 | 328.258 | 237.132 |
| 2021-03-13 | 0.467 | 84.876 | 9.818 | 86.519 | 164.746 | 334.742 | 240.819 |
| 2021-03-14 | 0.473 | 85.115 | 8.973 | 85.324 | 163.534 | 337.004 | 242.009 |
| 2021-03-15 | 0.428 | 84.215 | 9.077 | 86.13 | 168.596 | 344.332 | 245.652 |
| 2021-03-16 | 0.451 | 83.945 | 9.04 | 85.121 | 166.992 | 349.324 | 248.055 |
| 2021-03-17 | 0.428 | 85.268 | 9.364 | 84.762 | 167.521 | 353.532 | 249.583 |
| 2021-03-18 | 0.456 | 87.198 | 9.541 | 83.8 | 166.678 | 356.05 | 250.921 |
| 2021-03-19 | 0.451 | 89.923 | 9.774 | 79.937 | 166.724 | 364.249 | 255.897 |
| 2021-03-20 | 0.445 | 91.394 | 10.07 | 80.051 | 167.787 | 361.855 | 254.143 |
| 2021-03-21 | 0.428 | 92.967 | 10.218 | 81.534 | 165.849 | 370.313 | 259.928 |
| 2021-03-22 | 0.417 | 96.965 | 10.3 | 82.075 | 163.641 | 373.26 | 262.634 |
| 2021-03-23 | 0.377 | 99.671 | 10.725 | 82.257 | 163.487 | 372.378 | 262.368 |
| 2021-03-24 | 0.36 | 101.731 | 11.21 | 81.927 | 175.597 | 373.821 | 264.227 |
| 2021-03-25 | 0.315 | 107.398 | 11.72 | 81.75 | 178.612 | 377.681 | 267.214 |
| 2021-03-26 | 0.338 | 110.411 | 12.295 | 84.71 | 185.441 | 377.666 | 268.092 |
| 2021-03-27 | 0.355 | 113.824 | 12.843 | 81.03 | 188.63 | 381.207 | 270.629 |
| 2021-03-28 | 0.394 | 117.845 | 13.609 | 77.93 | 192.69 | 375.172 | 267.45 |
| 2021-03-29 | 0.479 | 123.162 | 14.179 | 76.46 | 200.452 | 373.776 | 267.679 |
| 2021-03-30 | 0.467 | 123.861 | 14.885 | 73.598 | 203.78 | 378.308 | 271.163 |
| 2021-03-31 | 0.518 | 142.024 | 15.892 | 70.28 | 195.11 | 379.776 | 273.339 |
| 2021-04-01 | 0.529 | 144.445 | 16.669 | 66.557 | 200.15 | 376.212 | 272.01 |
| 2021-04-02 | 0.501 | 139.253 | 17.503 | 60.604 | 196.89 | 367.786 | 266.869 |
| 2021-04-03 | 0.501 | 149.792 | 18.262 | 59.659 | 197.05 | 354.583 | 260.279 |
| 2021-04-04 | 0.456 | 147.242 | 19.098 | 56.314 | 193.514 | 352.037 | 259.082 |
| 2021-04-05 | 0.389 | 155.071 | 19.41 | 52.27 | 197.104 | 339.045 | 249.185 |
| 2021-04-06 | 0.422 | 181.564 | 19.947 | 48.72 | 196.797 | 322.182 | 244.041 |
| 2021-04-07 | 0.355 | 176.471 | 20.613 | 45.962 | 200.279 | 304.83 | 231.659 |
| 2021-04-08 | 0.321 | 185.954 | 21.623 | 42.867 | 200.641 | 305.166 | 233.95 |
| 2021-04-09 | 0.31 | 206.564 | 22.49 | 25.207 | 206.241 | 302.618 | 234.661 |
| 2021-04-10 | 0.321 | 208.099 | 23.571 | 23.414 | 207.751 | 302.633 | 235.604 |
| 2021-04-11 | 0.349 | 224.061 | 23.772 | 22.202 | 212.716 | 304.328 | 238.809 |
| 2021-04-12 | 0.36 | 233.167 | 24.391 | 23.925 | 209.474 | 309.358 | 246.752 |
| 2021-04-13 | 0.4 | 220.622 | 25.334 | 24.121 | 217.018 | 318.315 | 250.526 |
| 2021-04-14 | 0.473 | 226.725 | 27.63 | 23.542 | 217.165 | 320.909 | 256.06 |
| 2021-04-15 | 0.529 | 231.943 | 28.789 | 22.775 | 214.732 | 306.094 | 247.305 |
| 2021-04-16 | 0.58 | 232.882 | 29.955 | 39.054 | 213.554 | 299.911 | 244.481 |
| 2021-04-17 | 0.642 | 232.247 | 31.195 | 38.246 | 207.39 | 293.749 | 241.218 |
| 2021-04-18 | 0.642 | 234.136 | 32.792 | 38.571 | 205.492 | 281.931 | 233.698 |
| 2021-04-19 | 0.715 | 232.243 | 32.974 | 37.278 | 204.492 | 278.191 | 231.46 |
| 2021-04-20 | 0.71 | 231.495 | 34.698 | 37.391 | 197.265 | 272.553 | 228.009 |
| 2021-04-21 | 0.704 | 228.614 | 34.57 | 37.188 | 191.817 | 267.226 | 225.005 |
| 2021-04-22 | 0.867 | 226.508 | 35.714 | 37.31 | 188.757 | 262.056 | 222.732 |
| 2021-04-23 | 0.867 | 223.696 | 36.283 | 37.143 | 181.1 | 258.848 | 219.436 |
| 2021-04-24 | 0.811 | 223.86 | 37.211 | 36.833 | 181.531 | 256.17 | 216.859 |
| 2021-04-25 | 0.828 | 218.984 | 37.79 | 36.47 | 177.199 | 251.927 | 212.962 |
| 2021-04-26 | 0.907 | 213.724 | 38.932 | 34.548 | 168.39 | 247.74 | 209.407 |
| 2021-04-27 | 0.98 | 212.276 | 38.924 | 34.892 | 163.856 | 242.429 | 205.302 |
| 2021-04-28 | 1.008 | 212.314 | 37.144 | 34.401 | 160.491 | 236.783 | 200.477 |
| 2021-04-29 | 0.901 | 212.827 | 39.846 | 33.796 | 156.549 | 232.887 | 196.16 |
| 2021-04-30 | 0.89 | 211.573 | 39.473 | 33.161 | 154.6 | 225.239 | 191.498 |
| 2021-05-01 | 0.907 | 208.445 | 39.888 | 32.832 | 151.092 | 222.643 | 189.196 |
| 2021-05-02 | 0.89 | 204.796 | 41.329 | 32.744 | 149.918 | 217.736 | 185.435 |
| 2021-05-03 | 0.749 | 212.766 | 42.678 | 31.857 | 151.167 | 216.01 | 183.432 |
| 2021-05-04 | 0.648 | 211.979 | 41.808 | 30.277 | 146.761 | 210.609 | 179.27 |
| 2021-05-05 | 0.625 | 210.284 | 42.116 | 30.23 | 142.239 | 204.06 | 173.479 |
| 2021-05-06 | 0.535 | 205.598 | 38.121 | 30.589 | 137.589 | 200.385 | 170.101 |
| 2021-05-07 | 0.535 | 203.246 | 39.662 | 30.822 | 132.961 | 198.84 | 167.846 |
| 2021-05-08 | 0.552 | 201.501 | 41.087 | 31.122 | 128.256 | 195.29 | 164.995 |
| 2021-05-09 | 0.524 | 200.464 | 41.858 | 31.333 | 124.785 | 194.809 | 163.939 |
| 2021-05-10 | 0.496 | 192.601 | 42.29 | 32.847 | 118.839 | 193.42 | 162.129 |
| 2021-05-11 | 0.456 | 187.797 | 44.737 | 33.975 | 115.757 | 191.145 | 159.558 |
| 2021-05-12 | 0.4 | 183.073 | 48.644 | 34.274 | 111.902 | 187.733 | 157.32 |
| 2021-05-13 | 0.36 | 174.822 | 50.888 | 34.366 | 107.799 | 176.245 | 148.527 |
| 2021-05-14 | 0.327 | 171.565 | 51.162 | 33.732 | 105.627 | 170.312 | 144.972 |
| 2021-05-15 | 0.299 | 165.503 | 50.124 | 33.689 | 103.155 | 163.223 | 140.327 |
| 2021-05-16 | 0.265 | 160.217 | 48.638 | 34.022 | 101.184 | 160.045 | 137.954 |
| 2021-05-17 | 0.253 | 150.944 | 47.372 | 33.214 | 97.602 | 154.55 | 133.351 |
| 2021-05-18 | 0.259 | 145.254 | 46.064 | 22.873 | 95.063 | 146.132 | 127.137 |
| 2021-05-19 | 0.225 | 138.63 | 44.178 | 22.555 | 92.197 | 140.149 | 123.165 |
| 2021-05-20 | 0.237 | 135.02 | 43.435 | 22.636 | 88.739 | 105.278 | 101.135 |
| 2021-05-21 | 0.22 | 126.461 | 42.265 | 23.724 | 82.665 | 97.287 | 94.679 |
| 2021-05-22 | 0.18 | 121.764 | 40.742 | 24.784 | 78.733 | 93.592 | 92.769 |
| 2021-05-23 | 0.231 | 116.648 | 39.362 | 25.139 | 76.987 | 89.548 | 90.59 |
| 2021-05-24 | 0.203 | 92.234 | 35.132 | 20.909 | 64.511 | 76.838 | 77.437 |